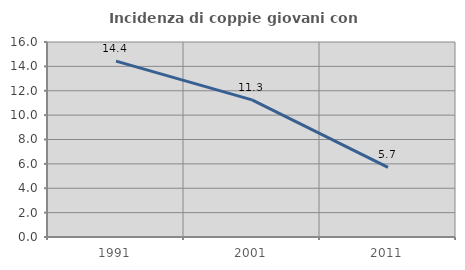
| Category | Incidenza di coppie giovani con figli |
|---|---|
| 1991.0 | 14.428 |
| 2001.0 | 11.255 |
| 2011.0 | 5.718 |